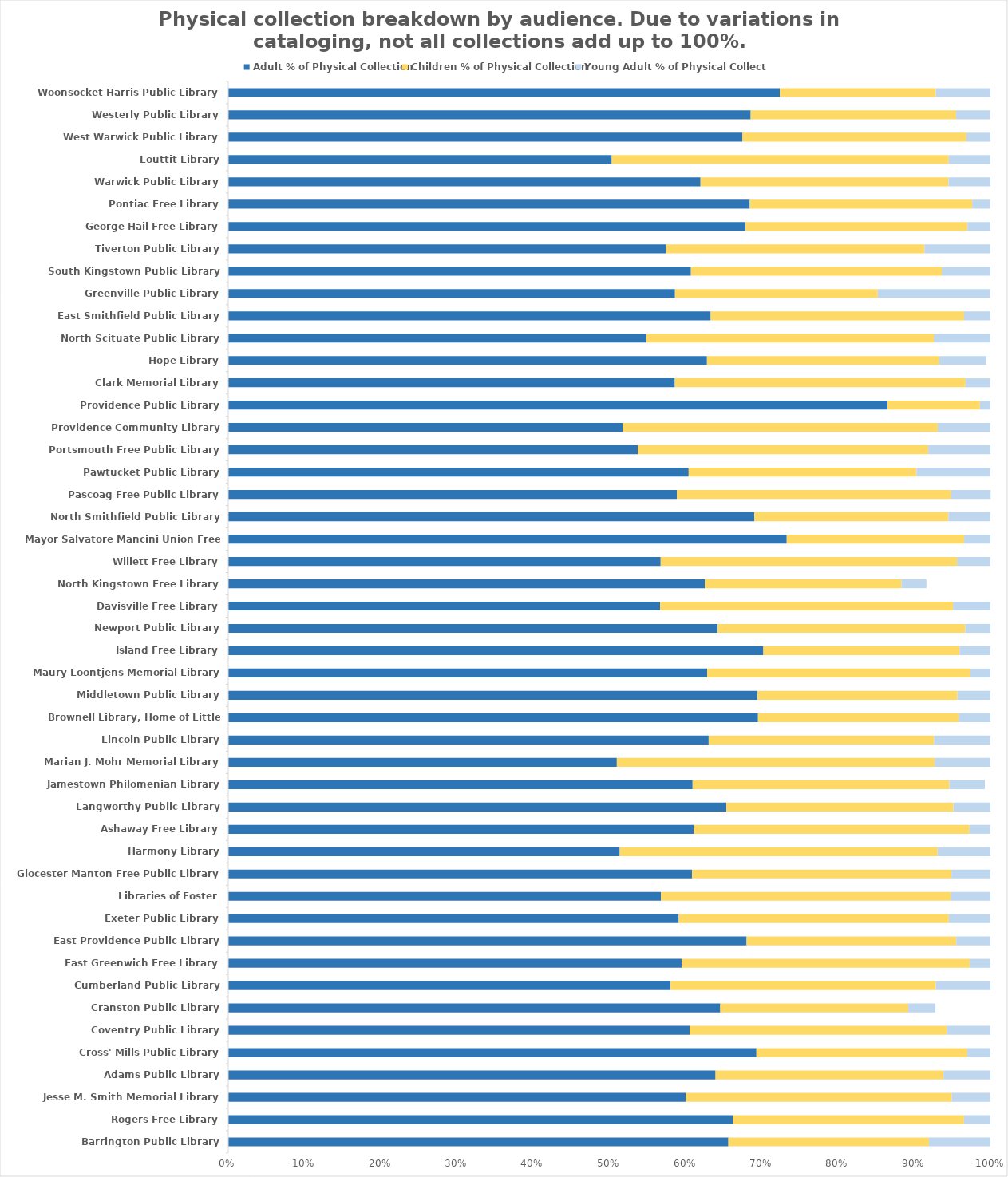
| Category | Adult % of Physical Collection | Children % of Physical Collection | Young Adult % of Physical Collection |
|---|---|---|---|
| Barrington Public Library | 0.656 | 0.263 | 0.081 |
| Rogers Free Library | 0.662 | 0.303 | 0.035 |
| Jesse M. Smith Memorial Library | 0.6 | 0.349 | 0.051 |
| Adams Public Library | 0.639 | 0.299 | 0.062 |
| Cross' Mills Public Library | 0.693 | 0.277 | 0.03 |
| Coventry Public Library | 0.605 | 0.337 | 0.057 |
| Cranston Public Library | 0.646 | 0.247 | 0.036 |
| Cumberland Public Library | 0.58 | 0.348 | 0.072 |
| East Greenwich Free Library | 0.595 | 0.378 | 0.029 |
| East Providence Public Library | 0.68 | 0.275 | 0.045 |
| Exeter Public Library | 0.591 | 0.354 | 0.055 |
| Libraries of Foster | 0.568 | 0.38 | 0.052 |
| Glocester Manton Free Public Library | 0.609 | 0.34 | 0.051 |
| Harmony Library | 0.514 | 0.417 | 0.069 |
| Ashaway Free Library | 0.611 | 0.362 | 0.027 |
| Langworthy Public Library | 0.654 | 0.298 | 0.049 |
| Jamestown Philomenian Library | 0.609 | 0.337 | 0.047 |
| Marian J. Mohr Memorial Library | 0.51 | 0.417 | 0.073 |
| Lincoln Public Library | 0.63 | 0.296 | 0.074 |
| Brownell Library, Home of Little Compton | 0.695 | 0.263 | 0.042 |
| Middletown Public Library | 0.694 | 0.263 | 0.043 |
| Maury Loontjens Memorial Library | 0.628 | 0.345 | 0.029 |
| Island Free Library | 0.702 | 0.257 | 0.041 |
| Newport Public Library | 0.642 | 0.325 | 0.033 |
| Davisville Free Library | 0.567 | 0.384 | 0.049 |
| North Kingstown Free Library | 0.625 | 0.258 | 0.033 |
| Willett Free Library | 0.567 | 0.389 | 0.044 |
| Mayor Salvatore Mancini Union Free Library | 0.733 | 0.233 | 0.034 |
| North Smithfield Public Library | 0.69 | 0.255 | 0.055 |
| Pascoag Free Public Library | 0.589 | 0.36 | 0.052 |
| Pawtucket Public Library | 0.604 | 0.299 | 0.097 |
| Portsmouth Free Public Library | 0.537 | 0.381 | 0.082 |
| Providence Community Library | 0.518 | 0.413 | 0.069 |
| Providence Public Library | 0.865 | 0.121 | 0.014 |
| Clark Memorial Library | 0.586 | 0.382 | 0.033 |
| Hope Library | 0.628 | 0.305 | 0.062 |
| North Scituate Public Library | 0.548 | 0.377 | 0.074 |
| East Smithfield Public Library | 0.633 | 0.332 | 0.035 |
| Greenville Public Library | 0.586 | 0.266 | 0.148 |
| South Kingstown Public Library | 0.607 | 0.329 | 0.064 |
| Tiverton Public Library | 0.574 | 0.339 | 0.086 |
| George Hail Free Library | 0.679 | 0.291 | 0.03 |
| Pontiac Free Library | 0.684 | 0.292 | 0.024 |
| Warwick Public Library | 0.62 | 0.325 | 0.055 |
| Louttit Library | 0.503 | 0.442 | 0.057 |
| West Warwick Public Library | 0.675 | 0.294 | 0.031 |
| Westerly Public Library | 0.685 | 0.27 | 0.045 |
| Woonsocket Harris Public Library | 0.724 | 0.204 | 0.072 |